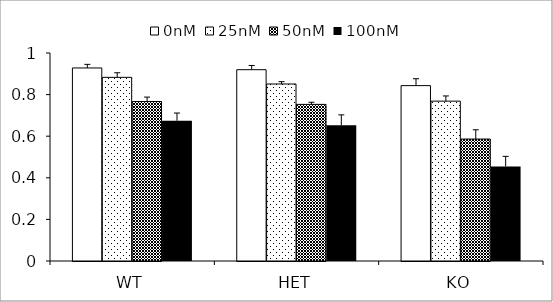
| Category | 0nM | 25nM | 50nM | 100nM |
|---|---|---|---|---|
| WT | 0.928 | 0.883 | 0.767 | 0.674 |
| HET | 0.92 | 0.851 | 0.753 | 0.653 |
| KO | 0.843 | 0.768 | 0.586 | 0.455 |